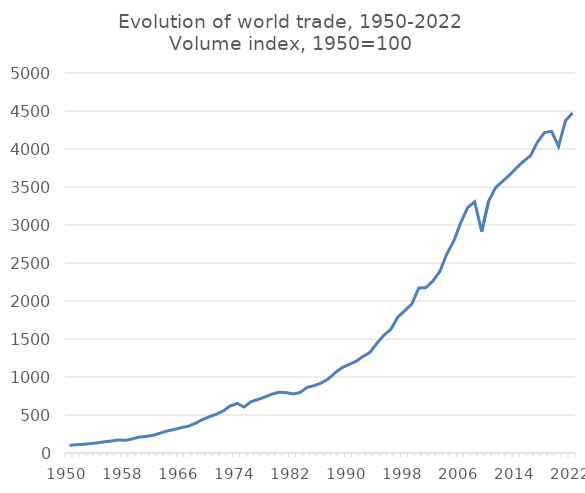
| Category | Volume (Total) |
|---|---|
| 1950-12-31 | 100 |
| 1951-01-01 | 109.524 |
| 1952-01-01 | 114.286 |
| 1953-01-01 | 123.81 |
| 1954-01-01 | 133.333 |
| 1955-01-01 | 147.619 |
| 1956-01-01 | 157.143 |
| 1957-01-01 | 171.429 |
| 1958-01-01 | 166.667 |
| 1959-01-01 | 185.714 |
| 1960-01-01 | 209.524 |
| 1961-01-01 | 219.048 |
| 1962-01-01 | 233.333 |
| 1963-01-01 | 261.905 |
| 1964-01-01 | 290.476 |
| 1965-01-01 | 309.524 |
| 1966-01-01 | 333.333 |
| 1967-01-01 | 352.381 |
| 1968-01-01 | 390.476 |
| 1969-01-01 | 438.095 |
| 1970-01-01 | 476.19 |
| 1971-01-01 | 509.524 |
| 1972-01-01 | 552.381 |
| 1973-01-01 | 619.048 |
| 1974-01-01 | 652.381 |
| 1975-01-01 | 604.762 |
| 1976-01-01 | 676.19 |
| 1977-01-01 | 704.762 |
| 1978-01-01 | 738.095 |
| 1979-01-01 | 776.19 |
| 1980-01-01 | 798.472 |
| 1981-01-01 | 794.823 |
| 1982-01-01 | 776.778 |
| 1983-01-01 | 796.034 |
| 1984-01-01 | 862.731 |
| 1985-01-01 | 885.155 |
| 1986-01-01 | 920.748 |
| 1987-01-01 | 971.43 |
| 1988-01-01 | 1054.035 |
| 1989-01-01 | 1121.934 |
| 1990-01-01 | 1164.652 |
| 1991-01-01 | 1205.723 |
| 1992-01-01 | 1269.793 |
| 1993-01-01 | 1323.119 |
| 1994-01-01 | 1443.797 |
| 1995-01-01 | 1549.565 |
| 1996-01-01 | 1627.788 |
| 1997-01-01 | 1789.84 |
| 1998-01-01 | 1872.663 |
| 1999-01-01 | 1961.213 |
| 2000-01-01 | 2171.367 |
| 2001-01-01 | 2174.28 |
| 2002-01-01 | 2261.207 |
| 2003-01-01 | 2387.597 |
| 2004-01-01 | 2617.608 |
| 2005-01-01 | 2788.697 |
| 2006-01-01 | 3030.554 |
| 2007-01-01 | 3230.072 |
| 2008-01-01 | 3305.054 |
| 2009-01-01 | 2913.969 |
| 2010-01-01 | 3316.607 |
| 2011-01-01 | 3492.671 |
| 2012-01-01 | 3574.792 |
| 2013-01-01 | 3659.378 |
| 2014-01-01 | 3753.428 |
| 2015-01-01 | 3838.808 |
| 2016-01-01 | 3912.802 |
| 2017-01-01 | 4093.47 |
| 2018-01-01 | 4216.813 |
| 2019-01-01 | 4232.016 |
| 2020-01-01 | 4033.545 |
| 2021-01-02 | 4373.548 |
| 2022-01-04 | 4472.845 |